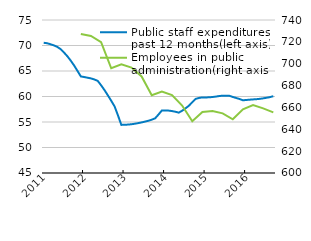
| Category | Public staff expenditures, past 12 months(left axis) |
|---|---|
| 2011-01-31 | 70533 |
| 2011-02-28 | 70449 |
| 2011-03-31 | 70251 |
| 2011-04-30 | 70030 |
| 2011-05-31 | 69736 |
| 2011-06-30 | 69294 |
| 2011-07-31 | 68635 |
| 2011-08-31 | 67898 |
| 2011-09-30 | 67041 |
| 2011-10-31 | 66092 |
| 2011-11-30 | 65026 |
| 2011-12-31 | 63937 |
| 2012-01-31 | 63815 |
| 2012-02-29 | 63682 |
| 2012-03-31 | 63550 |
| 2012-04-30 | 63339 |
| 2012-05-31 | 63067 |
| 2012-06-30 | 62205 |
| 2012-07-31 | 61263 |
| 2012-08-31 | 60232 |
| 2012-09-30 | 59166 |
| 2012-10-31 | 58049 |
| 2012-11-30 | 56289 |
| 2012-12-31 | 54433 |
| 2013-01-31 | 54460 |
| 2013-02-28 | 54494 |
| 2013-03-31 | 54559 |
| 2013-04-30 | 54663 |
| 2013-05-31 | 54780 |
| 2013-06-30 | 54923 |
| 2013-07-31 | 55073 |
| 2013-08-31 | 55241 |
| 2013-09-30 | 55457 |
| 2013-10-31 | 55719 |
| 2013-11-30 | 56465 |
| 2013-12-31 | 57262 |
| 2014-01-31 | 57264 |
| 2014-02-28 | 57234 |
| 2014-03-31 | 57143 |
| 2014-04-30 | 57008 |
| 2014-05-31 | 56836 |
| 2014-06-30 | 57210 |
| 2014-07-31 | 57680 |
| 2014-08-31 | 58190 |
| 2014-09-30 | 58867 |
| 2014-10-31 | 59529 |
| 2014-11-30 | 59722 |
| 2014-12-31 | 59823 |
| 2015-01-31 | 59818 |
| 2015-02-28 | 59838 |
| 2015-03-31 | 59901 |
| 2015-04-30 | 59986 |
| 2015-05-31 | 60094 |
| 2015-06-30 | 60157 |
| 2015-07-31 | 60160 |
| 2015-08-31 | 60142 |
| 2015-09-30 | 59909 |
| 2015-10-31 | 59710 |
| 2015-11-30 | 59507 |
| 2015-12-31 | 59262 |
| 2016-01-31 | 59315 |
| 2016-02-29 | 59375 |
| 2016-03-31 | 59431 |
| 2016-04-30 | 59472 |
| 2016-05-31 | 59543 |
| 2016-06-30 | 59638 |
| 2016-07-31 | 59753 |
| 2016-08-31 | 59880 |
| 2016-09-30 | 60067 |